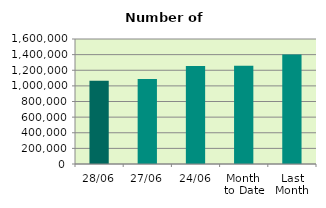
| Category | Series 0 |
|---|---|
| 28/06 | 1065608 |
| 27/06 | 1088688 |
| 24/06 | 1255170 |
| Month 
to Date | 1259064.2 |
| Last
Month | 1401172.455 |